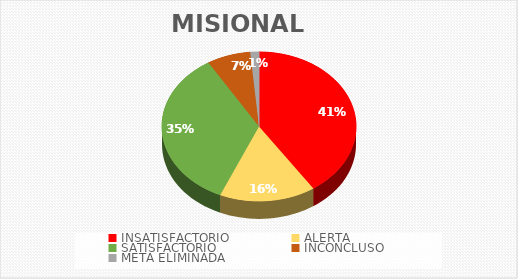
| Category | MISIONAL | ESTRATÉGICO | APOYO | EVALUACIÓN |
|---|---|---|---|---|
| INSATISFACTORIO | 28 | 3 | 2 | 1 |
| ALERTA | 11 | 1 | 12 | 0 |
| SATISFACTORIO | 24 | 10 | 10 | 1 |
| INCONCLUSO | 5 | 0 | 5 | 1 |
| META ELIMINADA | 1 | 0 | 0 | 0 |